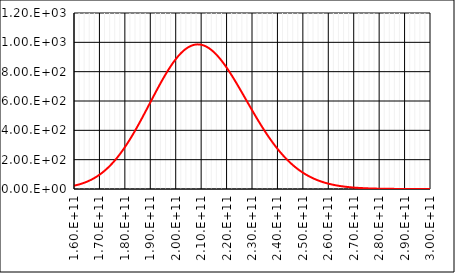
| Category | Series 0 |
|---|---|
| 160000000000.0 | 22.509 |
| 162000000000.0 | 31.129 |
| 164000000000.0 | 42.351 |
| 166000000000.0 | 56.699 |
| 168000000000.0 | 74.716 |
| 170000000000.0 | 96.941 |
| 172000000000.0 | 123.873 |
| 174000000000.0 | 155.933 |
| 176000000000.0 | 193.418 |
| 178000000000.0 | 236.466 |
| 180000000000.0 | 285.008 |
| 182000000000.0 | 338.738 |
| 184000000000.0 | 397.09 |
| 186000000000.0 | 459.23 |
| 188000000000.0 | 524.062 |
| 190000000000.0 | 590.253 |
| 192000000000.0 | 656.275 |
| 194000000000.0 | 720.467 |
| 196000000000.0 | 781.101 |
| 198000000000.0 | 836.466 |
| 200000000000.0 | 884.95 |
| 202000000000.0 | 925.117 |
| 204000000000.0 | 955.784 |
| 206000000000.0 | 976.074 |
| 208000000000.0 | 985.459 |
| 210000000000.0 | 983.782 |
| 212000000000.0 | 971.256 |
| 214000000000.0 | 948.443 |
| 216000000000.0 | 916.215 |
| 218000000000.0 | 875.705 |
| 220000000000.0 | 828.239 |
| 222000000000.0 | 775.27 |
| 224000000000.0 | 718.308 |
| 226000000000.0 | 658.852 |
| 228000000000.0 | 598.333 |
| 230000000000.0 | 538.062 |
| 232000000000.0 | 479.194 |
| 234000000000.0 | 422.703 |
| 236000000000.0 | 369.365 |
| 238000000000.0 | 319.761 |
| 240000000000.0 | 274.282 |
| 242000000000.0 | 233.14 |
| 244000000000.0 | 196.398 |
| 246000000000.0 | 163.985 |
| 248000000000.0 | 135.727 |
| 250000000000.0 | 111.37 |
| 252000000000.0 | 90.605 |
| 254000000000.0 | 73.091 |
| 256000000000.0 | 58.473 |
| 258000000000.0 | 46.393 |
| 260000000000.0 | 36.51 |
| 262000000000.0 | 28.502 |
| 264000000000.0 | 22.073 |
| 266000000000.0 | 16.96 |
| 268000000000.0 | 12.93 |
| 270000000000.0 | 9.783 |
| 272000000000.0 | 7.345 |
| 274000000000.0 | 5.473 |
| 276000000000.0 | 4.048 |
| 278000000000.0 | 2.972 |
| 280000000000.0 | 2.166 |
| 282000000000.0 | 1.568 |
| 284000000000.0 | 1.126 |
| 286000000000.0 | 0.803 |
| 288000000000.0 | 0.569 |
| 290000000000.0 | 0.4 |
| 292000000000.0 | 0.28 |
| 294000000000.0 | 0.194 |
| 296000000000.0 | 0.134 |
| 298000000000.0 | 0.092 |
| 300000000000.0 | 0.062 |